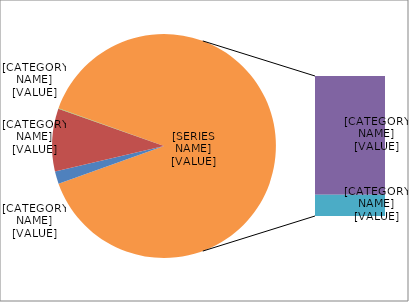
| Category | Credit, counterparty credit and dilution risks and free deliveries |
|---|---|
| Position, foreign exchange and commodities risks | 0.018 |
| Operational risk | 0.09 |
| Credit valuation adjustment | 0.001 |
| Standardised approach | 0.755 |
| Internal ratings based approach | 0.135 |